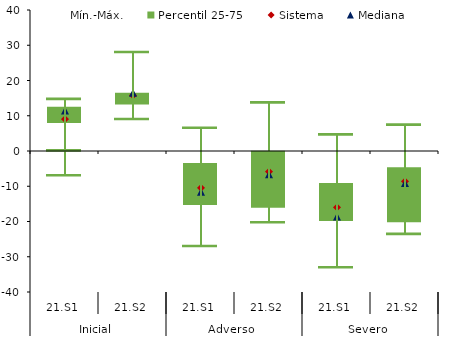
| Category | Mediana | P25 | Mínimo | Linea | Mín.-Máx. | Percentil 25-75 | Max |
|---|---|---|---|---|---|---|---|
| 0 | 3.331 | 8.153 | -6.974 | 0.1 | 0 | 0.944 | 2.075 |
| 1 | 3 | 4.5 | 0 | 0.1 | 8.9 | 0 | 11.4 |
| 2 | 0 | 0 | -12.031 | 0.1 | 0 | 0 | 6.4 |
| 3 | 0 | 0 | -4.5 | 0.1 | 0 | 0.1 | 13.5 |
| 4 | 0 | 0 | -13.49 | 0.1 | 0 | 0 | 4.51 |
| 5 | 0 | 0 | -3.7 | 0.1 | 0 | 0 | 7.3 |